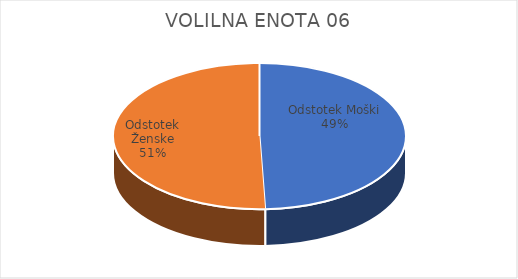
| Category | VOLILNA ENOTA 06 | #REF! | Slovenija skupaj |
|---|---|---|---|
| Odstotek Moški | 13.64 |  | 13.7 |
| Odstotek Ženske | 13.98 |  | 14.52 |